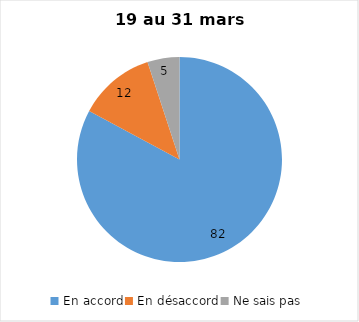
| Category | Series 0 |
|---|---|
| En accord | 82 |
| En désaccord | 12 |
| Ne sais pas | 5 |